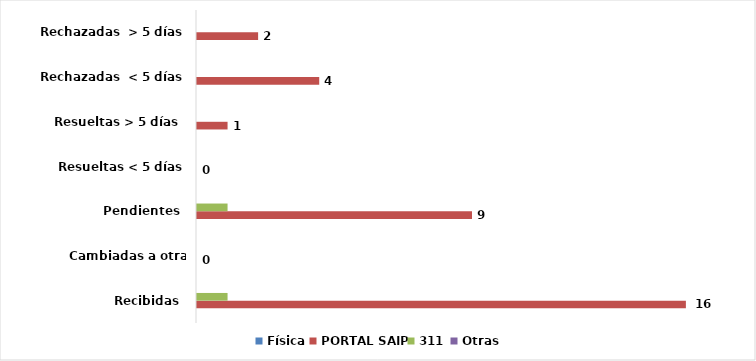
| Category | Física | PORTAL SAIP | 311 | Otras |
|---|---|---|---|---|
| Recibidas  | 0 | 16 | 1 | 0 |
| Cambiadas a otra institución | 0 | 0 | 0 | 0 |
| Pendientes  | 0 | 9 | 1 | 0 |
| Resueltas < 5 días | 0 | 0 | 0 | 0 |
| Resueltas > 5 días  | 0 | 1 | 0 | 0 |
| Rechazadas  < 5 días | 0 | 4 | 0 | 0 |
| Rechazadas  > 5 días | 0 | 2 | 0 | 0 |